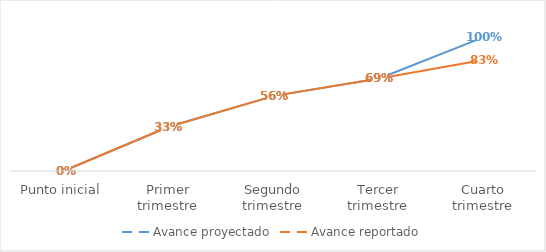
| Category | Avance proyectado | Avance reportado |
|---|---|---|
| Punto inicial | 0 | 0 |
| Primer trimestre | 0.33 | 0.33 |
| Segundo trimestre | 0.56 | 0.56 |
| Tercer trimestre | 0.69 | 0.69 |
| Cuarto trimestre | 1 | 0.83 |